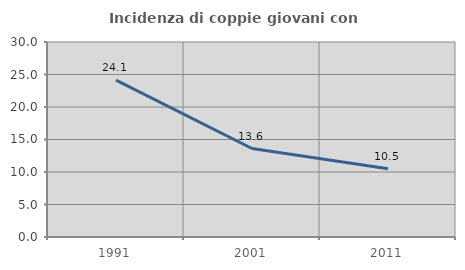
| Category | Incidenza di coppie giovani con figli |
|---|---|
| 1991.0 | 24.145 |
| 2001.0 | 13.615 |
| 2011.0 | 10.488 |